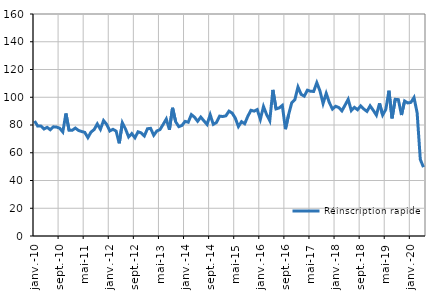
| Category | Réinscription rapide |
|---|---|
| 2010-01-01 | 82.9 |
| 2010-02-01 | 79.2 |
| 2010-03-01 | 79.3 |
| 2010-04-01 | 77.1 |
| 2010-05-01 | 78.3 |
| 2010-06-01 | 76.6 |
| 2010-07-01 | 78.7 |
| 2010-08-01 | 78.5 |
| 2010-09-01 | 77.7 |
| 2010-10-01 | 75 |
| 2010-11-01 | 88.3 |
| 2010-12-01 | 76.2 |
| 2011-01-01 | 76.2 |
| 2011-02-01 | 77.8 |
| 2011-03-01 | 76.1 |
| 2011-04-01 | 75.3 |
| 2011-05-01 | 74.7 |
| 2011-06-01 | 70.9 |
| 2011-07-01 | 74.9 |
| 2011-08-01 | 76.7 |
| 2011-09-01 | 80.8 |
| 2011-10-01 | 76.9 |
| 2011-11-01 | 83.2 |
| 2011-12-01 | 80.4 |
| 2012-01-01 | 75.7 |
| 2012-02-01 | 76.9 |
| 2012-03-01 | 75.6 |
| 2012-04-01 | 66.8 |
| 2012-05-01 | 81.6 |
| 2012-06-01 | 77.1 |
| 2012-07-01 | 71.4 |
| 2012-08-01 | 73.8 |
| 2012-09-01 | 70.8 |
| 2012-10-01 | 75.1 |
| 2012-11-01 | 74.3 |
| 2012-12-01 | 72.1 |
| 2013-01-01 | 77.3 |
| 2013-02-01 | 77.6 |
| 2013-03-01 | 72.6 |
| 2013-04-01 | 75.7 |
| 2013-05-01 | 76.7 |
| 2013-06-01 | 80.4 |
| 2013-07-01 | 84.3 |
| 2013-08-01 | 76.6 |
| 2013-09-01 | 92.4 |
| 2013-10-01 | 82.3 |
| 2013-11-01 | 78.8 |
| 2013-12-01 | 79.7 |
| 2014-01-01 | 82.6 |
| 2014-02-01 | 82 |
| 2014-03-01 | 87.5 |
| 2014-04-01 | 85.6 |
| 2014-05-01 | 82.7 |
| 2014-06-01 | 85.7 |
| 2014-07-01 | 83 |
| 2014-08-01 | 80.4 |
| 2014-09-01 | 87.4 |
| 2014-10-01 | 80.5 |
| 2014-11-01 | 81.8 |
| 2014-12-01 | 86.4 |
| 2015-01-01 | 86.1 |
| 2015-02-01 | 86.6 |
| 2015-03-01 | 90 |
| 2015-04-01 | 88.6 |
| 2015-05-01 | 85 |
| 2015-06-01 | 78.9 |
| 2015-07-01 | 82.4 |
| 2015-08-01 | 80.9 |
| 2015-09-01 | 86.3 |
| 2015-10-01 | 90.6 |
| 2015-11-01 | 90 |
| 2015-12-01 | 91.1 |
| 2016-01-01 | 84.1 |
| 2016-02-01 | 93.3 |
| 2016-03-01 | 87.5 |
| 2016-04-01 | 83.1 |
| 2016-05-01 | 105.3 |
| 2016-06-01 | 91.6 |
| 2016-07-01 | 92.3 |
| 2016-08-01 | 94.1 |
| 2016-09-01 | 77 |
| 2016-10-01 | 87.4 |
| 2016-11-01 | 96 |
| 2016-12-01 | 98.3 |
| 2017-01-01 | 107.4 |
| 2017-02-01 | 102.1 |
| 2017-03-01 | 100.8 |
| 2017-04-01 | 105.1 |
| 2017-05-01 | 104.3 |
| 2017-06-01 | 104.2 |
| 2017-07-01 | 110.5 |
| 2017-08-01 | 104.6 |
| 2017-09-01 | 95.5 |
| 2017-10-01 | 102.8 |
| 2017-11-01 | 96.1 |
| 2017-12-01 | 91.5 |
| 2018-01-01 | 93.5 |
| 2018-02-01 | 92.6 |
| 2018-03-01 | 90.2 |
| 2018-04-01 | 94.3 |
| 2018-05-01 | 98.5 |
| 2018-06-01 | 90.4 |
| 2018-07-01 | 92.7 |
| 2018-08-01 | 91 |
| 2018-09-01 | 93.8 |
| 2018-10-01 | 91.5 |
| 2018-11-01 | 89.8 |
| 2018-12-01 | 93.8 |
| 2019-01-01 | 90.6 |
| 2019-02-01 | 87.1 |
| 2019-03-01 | 95.6 |
| 2019-04-01 | 87.2 |
| 2019-05-01 | 91.2 |
| 2019-06-01 | 104.7 |
| 2019-07-01 | 84.8 |
| 2019-08-01 | 98.5 |
| 2019-09-01 | 98.3 |
| 2019-10-01 | 87.2 |
| 2019-11-01 | 97.3 |
| 2019-12-01 | 95.9 |
| 2020-01-01 | 96.3 |
| 2020-02-01 | 99.8 |
| 2020-03-01 | 88.6 |
| 2020-04-01 | 55.2 |
| 2020-05-01 | 49.6 |